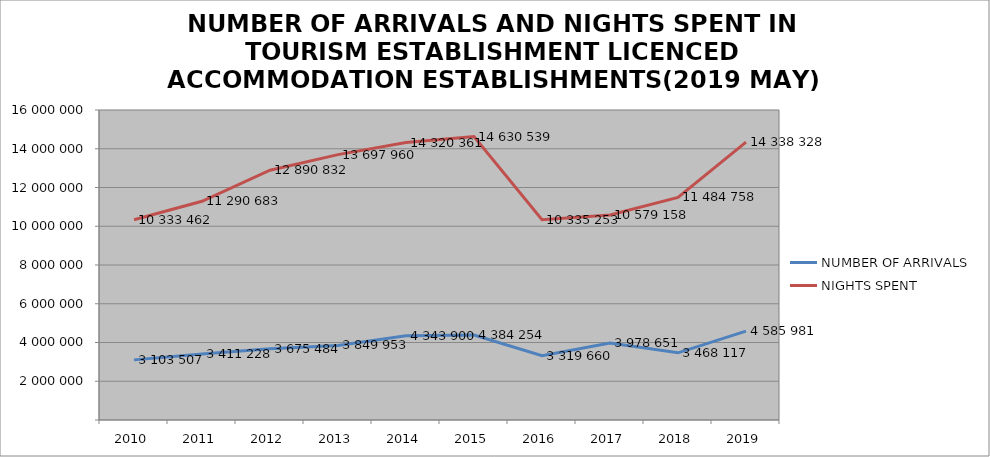
| Category | NUMBER OF ARRIVALS | NIGHTS SPENT |
|---|---|---|
| 2010 | 3103507 | 10333462 |
| 2011 | 3411228 | 11290683 |
| 2012 | 3675484 | 12890832 |
| 2013 | 3849953 | 13697960 |
| 2014 | 4343900 | 14320361 |
| 2015 | 4384254 | 14630539 |
| 2016 | 3319660 | 10335253 |
| 2017 | 3978651 | 10579158 |
| 2018 | 3468117 | 11484758 |
| 2019 | 4585981 | 14338328 |